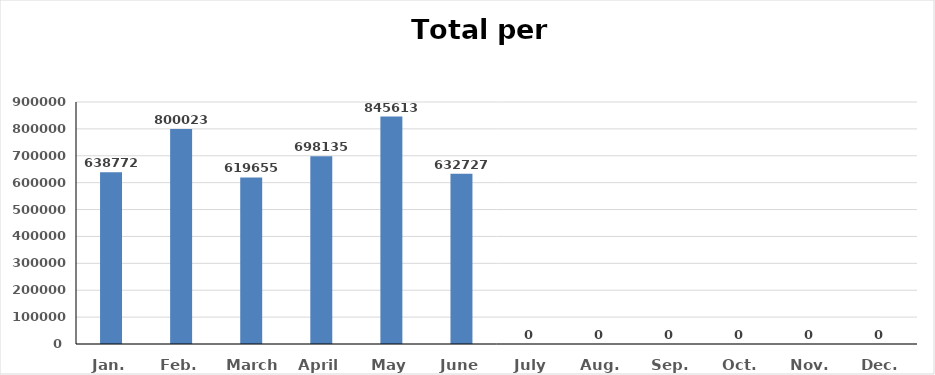
| Category | Series 0 |
|---|---|
| Jan. | 638772 |
| Feb. | 800023 |
| March | 619655 |
| April | 698135 |
| May | 845613 |
| June | 632727 |
| July | 0 |
| Aug. | 0 |
| Sep. | 0 |
| Oct. | 0 |
| Nov. | 0 |
| Dec. | 0 |